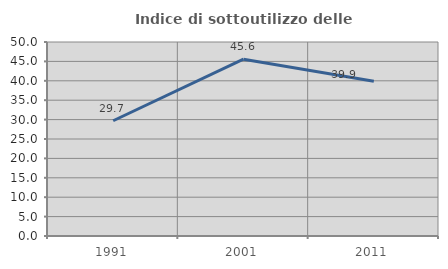
| Category | Indice di sottoutilizzo delle abitazioni  |
|---|---|
| 1991.0 | 29.708 |
| 2001.0 | 45.573 |
| 2011.0 | 39.9 |